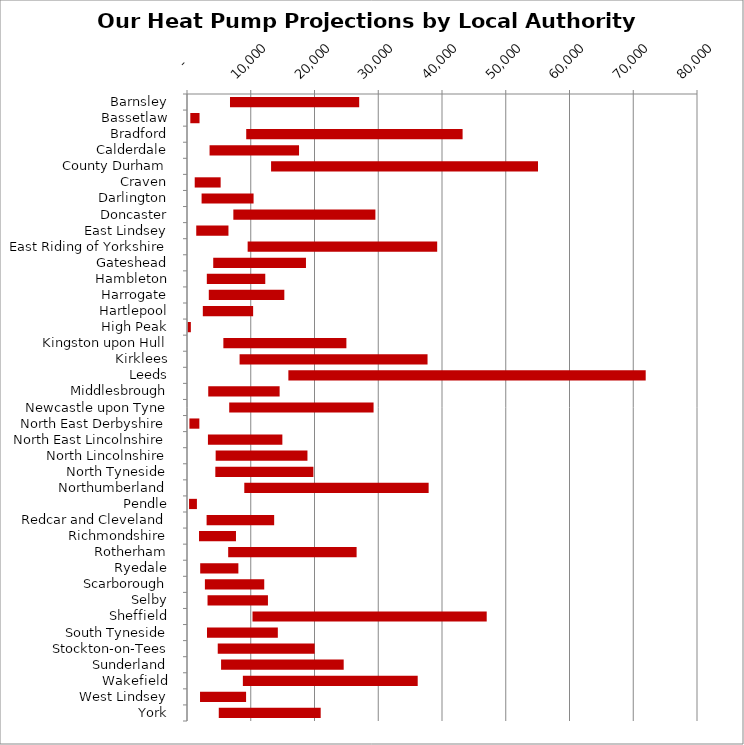
| Category | MIN | MAX |
|---|---|---|
| Barnsley | 6744 | 20267 |
| Bassetlaw | 520 | 1446 |
| Bradford | 9290 | 33941 |
| Calderdale | 3540 | 14035 |
| County Durham | 13188 | 41872 |
| Craven | 1210 | 4067 |
| Darlington | 2289 | 8155 |
| Doncaster | 7270 | 22282 |
| East Lindsey | 1450 | 5052 |
| East Riding of Yorkshire | 9513 | 29732 |
| Gateshead | 4115 | 14546 |
| Hambleton | 3109 | 9169 |
| Harrogate | 3419 | 11848 |
| Hartlepool | 2482 | 7892 |
| High Peak | 100 | 504 |
| Kingston upon Hull | 5705 | 19297 |
| Kirklees | 8249 | 29483 |
| Leeds | 15901 | 56052 |
| Middlesbrough | 3332 | 11198 |
| Newcastle upon Tyne | 6622 | 22644 |
| North East Derbyshire | 377 | 1561 |
| North East Lincolnshire | 3284 | 11674 |
| North Lincolnshire | 4496 | 14398 |
| North Tyneside | 4444 | 15382 |
| Northumberland | 8988 | 28917 |
| Pendle | 321 | 1235 |
| Redcar and Cleveland | 3075 | 10598 |
| Richmondshire | 1885 | 5798 |
| Rotherham | 6460 | 20145 |
| Ryedale | 2071 | 5987 |
| Scarborough | 2808 | 9308 |
| Selby | 3221 | 9476 |
| Sheffield | 10276 | 36738 |
| South Tyneside | 3137 | 11111 |
| Stockton-on-Tees | 4822 | 15207 |
| Sunderland | 5345 | 19234 |
| Wakefield | 8763 | 27426 |
| West Lindsey | 2043 | 7225 |
| York | 4984 | 15987 |